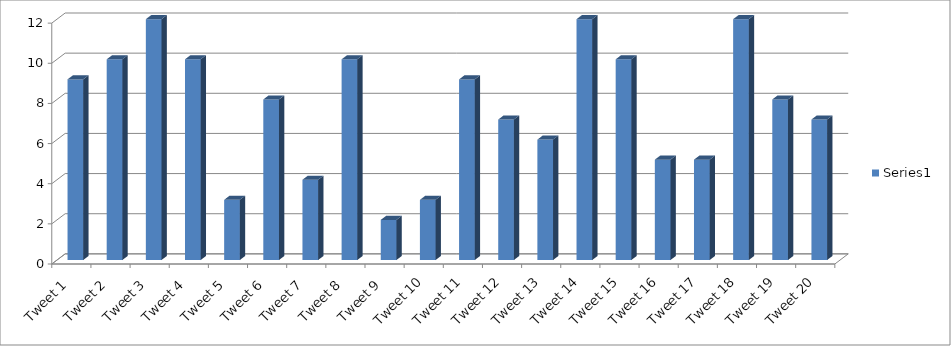
| Category | Series 0 |
|---|---|
| Tweet 1 | 9 |
| Tweet 2 | 10 |
| Tweet 3 | 12 |
| Tweet 4 | 10 |
| Tweet 5 | 3 |
| Tweet 6 | 8 |
| Tweet 7 | 4 |
| Tweet 8 | 10 |
| Tweet 9 | 2 |
| Tweet 10 | 3 |
| Tweet 11 | 9 |
| Tweet 12 | 7 |
| Tweet 13 | 6 |
| Tweet 14 | 12 |
| Tweet 15 | 10 |
| Tweet 16 | 5 |
| Tweet 17 | 5 |
| Tweet 18 | 12 |
| Tweet 19 | 8 |
| Tweet 20 | 7 |